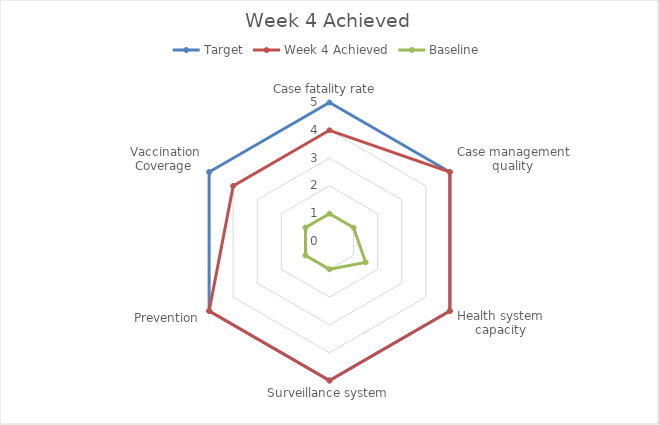
| Category | Target | Week 4 Achieved | Baseline |
|---|---|---|---|
| Case fatality rate  | 5 | 4 | 1 |
| Case management quality  | 5 | 5 | 1 |
| Health system capacity | 5 | 5 | 1.5 |
| Surveillance system | 5 | 5 | 1 |
| Prevention | 5 | 5 | 1 |
| Vaccination Coverage  | 5 | 4 | 1 |